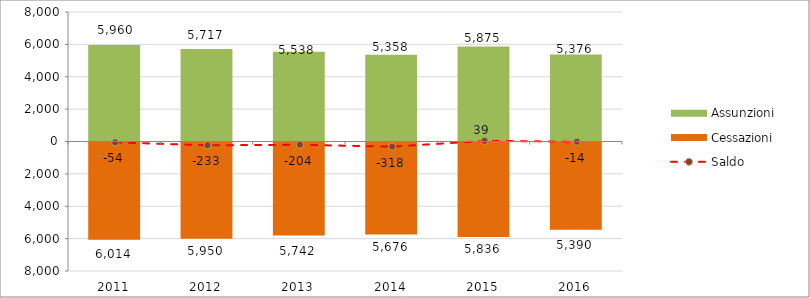
| Category | Assunzioni | Cessazioni |
|---|---|---|
| 2011.0 | 5960 | -6014 |
| 2012.0 | 5717 | -5950 |
| 2013.0 | 5538 | -5742 |
| 2014.0 | 5358 | -5676 |
| 2015.0 | 5875 | -5836 |
| 2016.0 | 5376 | -5390 |